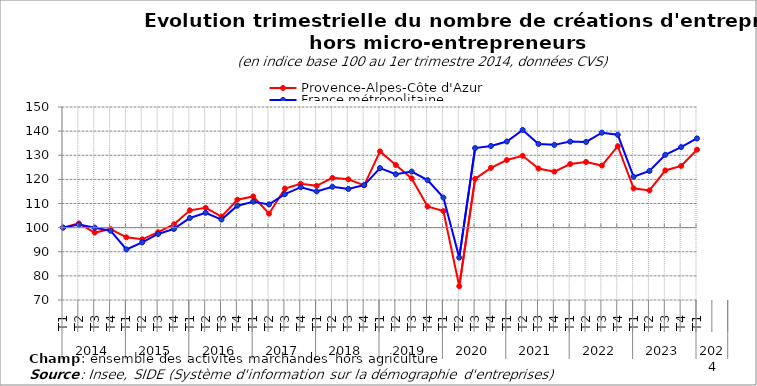
| Category | Provence-Alpes-Côte d'Azur | France métropolitaine |
|---|---|---|
| 0 | 100 | 100 |
| 1 | 101.74 | 101.242 |
| 2 | 97.945 | 99.99 |
| 3 | 99.411 | 98.72 |
| 4 | 95.985 | 90.965 |
| 5 | 95.149 | 93.897 |
| 6 | 98.095 | 97.366 |
| 7 | 101.37 | 99.46 |
| 8 | 107.153 | 103.99 |
| 9 | 108.235 | 106.152 |
| 10 | 104.563 | 103.346 |
| 11 | 111.579 | 109.088 |
| 12 | 112.921 | 110.751 |
| 13 | 105.782 | 109.638 |
| 14 | 116.196 | 113.884 |
| 15 | 118.197 | 116.758 |
| 16 | 117.347 | 115.012 |
| 17 | 120.622 | 116.947 |
| 18 | 120.033 | 116.038 |
| 19 | 117.539 | 117.639 |
| 20 | 131.598 | 124.69 |
| 21 | 125.966 | 122.117 |
| 22 | 120.403 | 123.235 |
| 23 | 108.756 | 119.68 |
| 24 | 106.824 | 112.457 |
| 25 | 75.706 | 87.567 |
| 26 | 120.211 | 132.988 |
| 27 | 124.774 | 133.819 |
| 28 | 128.008 | 135.695 |
| 29 | 129.789 | 140.495 |
| 30 | 124.5 | 134.687 |
| 31 | 123.212 | 134.307 |
| 32 | 126.35 | 135.649 |
| 33 | 127.213 | 135.51 |
| 34 | 125.719 | 139.357 |
| 35 | 133.749 | 138.487 |
| 36 | 116.278 | 121.09 |
| 37 | 115.415 | 123.478 |
| 38 | 123.705 | 130.18 |
| 39 | 125.555 | 133.38 |
| 40 | 132.297 | 136.969 |